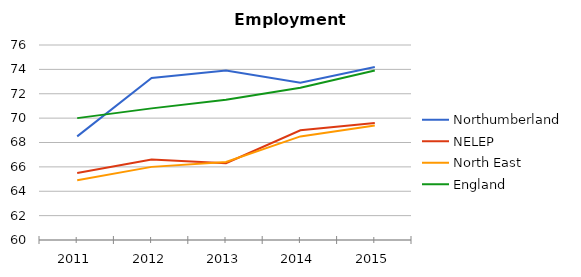
| Category | Northumberland | NELEP | North East | England |
|---|---|---|---|---|
| 2011.0 | 68.5 | 65.5 | 64.9 | 70 |
| 2012.0 | 73.3 | 66.6 | 66 | 70.8 |
| 2013.0 | 73.9 | 66.3 | 66.4 | 71.5 |
| 2014.0 | 72.9 | 69 | 68.5 | 72.5 |
| 2015.0 | 74.2 | 69.6 | 69.4 | 73.9 |